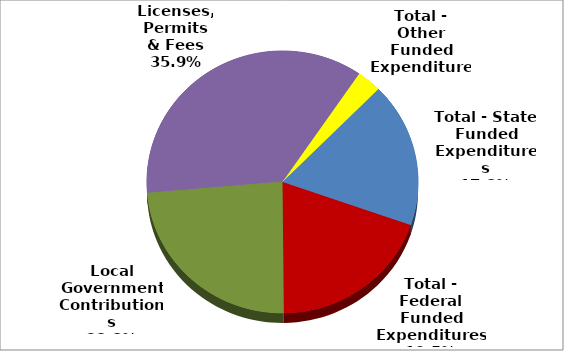
| Category | Series 0 |
|---|---|
| Total - State Funded Expenditures | 65423038.87 |
| Total - Federal Funded Expenditures | 71609379 |
| Local Government Contributions | 87220189.98 |
| Licenses, Permits & Fees | 131876822 |
| Total - Other Funded Expenditures | 10813352.03 |